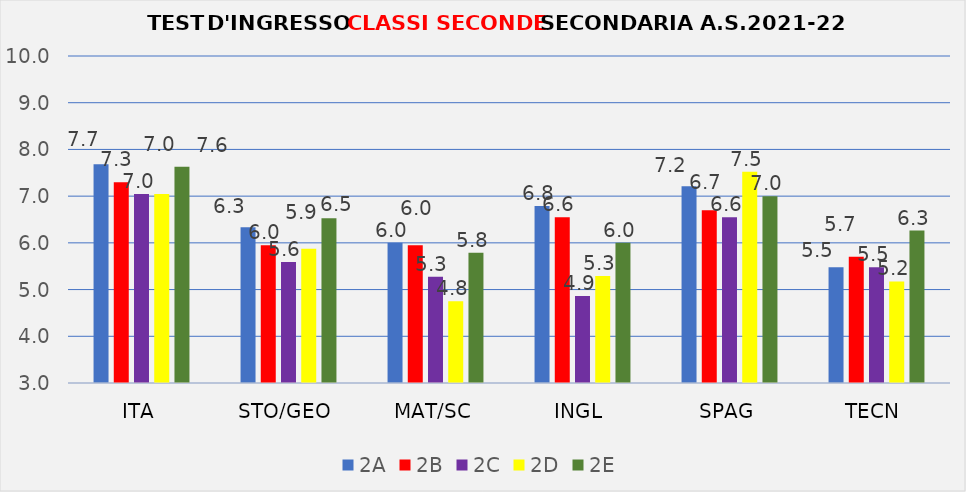
| Category | 2A | 2B | 2C | 2D | 2E |
|---|---|---|---|---|---|
| ITA | 7.684 | 7.3 | 7.045 | 7.043 | 7.632 |
| STO/GEO | 6.333 | 5.95 | 5.591 | 5.875 | 6.526 |
| MAT/SC | 6 | 5.95 | 5.273 | 4.75 | 5.789 |
| INGL | 6.789 | 6.55 | 4.864 | 5.292 | 6 |
| SPAG | 7.211 | 6.7 | 6.55 | 7.522 | 7 |
| TECN | 5.476 | 5.7 | 5.476 | 5.174 | 6.263 |